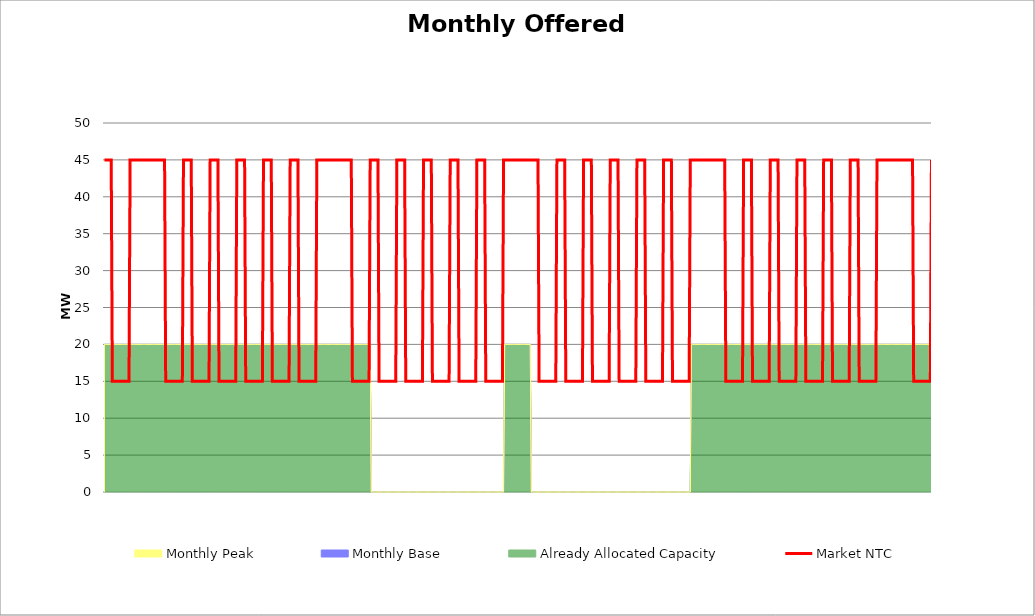
| Category | Market NTC |
|---|---|
| 0 | 45 |
| 1 | 45 |
| 2 | 45 |
| 3 | 45 |
| 4 | 45 |
| 5 | 45 |
| 6 | 45 |
| 7 | 15 |
| 8 | 15 |
| 9 | 15 |
| 10 | 15 |
| 11 | 15 |
| 12 | 15 |
| 13 | 15 |
| 14 | 15 |
| 15 | 15 |
| 16 | 15 |
| 17 | 15 |
| 18 | 15 |
| 19 | 15 |
| 20 | 15 |
| 21 | 15 |
| 22 | 15 |
| 23 | 45 |
| 24 | 45 |
| 25 | 45 |
| 26 | 45 |
| 27 | 45 |
| 28 | 45 |
| 29 | 45 |
| 30 | 45 |
| 31 | 45 |
| 32 | 45 |
| 33 | 45 |
| 34 | 45 |
| 35 | 45 |
| 36 | 45 |
| 37 | 45 |
| 38 | 45 |
| 39 | 45 |
| 40 | 45 |
| 41 | 45 |
| 42 | 45 |
| 43 | 45 |
| 44 | 45 |
| 45 | 45 |
| 46 | 45 |
| 47 | 45 |
| 48 | 45 |
| 49 | 45 |
| 50 | 45 |
| 51 | 45 |
| 52 | 45 |
| 53 | 45 |
| 54 | 45 |
| 55 | 15 |
| 56 | 15 |
| 57 | 15 |
| 58 | 15 |
| 59 | 15 |
| 60 | 15 |
| 61 | 15 |
| 62 | 15 |
| 63 | 15 |
| 64 | 15 |
| 65 | 15 |
| 66 | 15 |
| 67 | 15 |
| 68 | 15 |
| 69 | 15 |
| 70 | 15 |
| 71 | 45 |
| 72 | 45 |
| 73 | 45 |
| 74 | 45 |
| 75 | 45 |
| 76 | 45 |
| 77 | 45 |
| 78 | 45 |
| 79 | 15 |
| 80 | 15 |
| 81 | 15 |
| 82 | 15 |
| 83 | 15 |
| 84 | 15 |
| 85 | 15 |
| 86 | 15 |
| 87 | 15 |
| 88 | 15 |
| 89 | 15 |
| 90 | 15 |
| 91 | 15 |
| 92 | 15 |
| 93 | 15 |
| 94 | 15 |
| 95 | 45 |
| 96 | 45 |
| 97 | 45 |
| 98 | 45 |
| 99 | 45 |
| 100 | 45 |
| 101 | 45 |
| 102 | 45 |
| 103 | 15 |
| 104 | 15 |
| 105 | 15 |
| 106 | 15 |
| 107 | 15 |
| 108 | 15 |
| 109 | 15 |
| 110 | 15 |
| 111 | 15 |
| 112 | 15 |
| 113 | 15 |
| 114 | 15 |
| 115 | 15 |
| 116 | 15 |
| 117 | 15 |
| 118 | 15 |
| 119 | 45 |
| 120 | 45 |
| 121 | 45 |
| 122 | 45 |
| 123 | 45 |
| 124 | 45 |
| 125 | 45 |
| 126 | 45 |
| 127 | 15 |
| 128 | 15 |
| 129 | 15 |
| 130 | 15 |
| 131 | 15 |
| 132 | 15 |
| 133 | 15 |
| 134 | 15 |
| 135 | 15 |
| 136 | 15 |
| 137 | 15 |
| 138 | 15 |
| 139 | 15 |
| 140 | 15 |
| 141 | 15 |
| 142 | 15 |
| 143 | 45 |
| 144 | 45 |
| 145 | 45 |
| 146 | 45 |
| 147 | 45 |
| 148 | 45 |
| 149 | 45 |
| 150 | 45 |
| 151 | 15 |
| 152 | 15 |
| 153 | 15 |
| 154 | 15 |
| 155 | 15 |
| 156 | 15 |
| 157 | 15 |
| 158 | 15 |
| 159 | 15 |
| 160 | 15 |
| 161 | 15 |
| 162 | 15 |
| 163 | 15 |
| 164 | 15 |
| 165 | 15 |
| 166 | 15 |
| 167 | 45 |
| 168 | 45 |
| 169 | 45 |
| 170 | 45 |
| 171 | 45 |
| 172 | 45 |
| 173 | 45 |
| 174 | 45 |
| 175 | 15 |
| 176 | 15 |
| 177 | 15 |
| 178 | 15 |
| 179 | 15 |
| 180 | 15 |
| 181 | 15 |
| 182 | 15 |
| 183 | 15 |
| 184 | 15 |
| 185 | 15 |
| 186 | 15 |
| 187 | 15 |
| 188 | 15 |
| 189 | 15 |
| 190 | 15 |
| 191 | 45 |
| 192 | 45 |
| 193 | 45 |
| 194 | 45 |
| 195 | 45 |
| 196 | 45 |
| 197 | 45 |
| 198 | 45 |
| 199 | 45 |
| 200 | 45 |
| 201 | 45 |
| 202 | 45 |
| 203 | 45 |
| 204 | 45 |
| 205 | 45 |
| 206 | 45 |
| 207 | 45 |
| 208 | 45 |
| 209 | 45 |
| 210 | 45 |
| 211 | 45 |
| 212 | 45 |
| 213 | 45 |
| 214 | 45 |
| 215 | 45 |
| 216 | 45 |
| 217 | 45 |
| 218 | 45 |
| 219 | 45 |
| 220 | 45 |
| 221 | 45 |
| 222 | 45 |
| 223 | 15 |
| 224 | 15 |
| 225 | 15 |
| 226 | 15 |
| 227 | 15 |
| 228 | 15 |
| 229 | 15 |
| 230 | 15 |
| 231 | 15 |
| 232 | 15 |
| 233 | 15 |
| 234 | 15 |
| 235 | 15 |
| 236 | 15 |
| 237 | 15 |
| 238 | 15 |
| 239 | 45 |
| 240 | 45 |
| 241 | 45 |
| 242 | 45 |
| 243 | 45 |
| 244 | 45 |
| 245 | 45 |
| 246 | 45 |
| 247 | 15 |
| 248 | 15 |
| 249 | 15 |
| 250 | 15 |
| 251 | 15 |
| 252 | 15 |
| 253 | 15 |
| 254 | 15 |
| 255 | 15 |
| 256 | 15 |
| 257 | 15 |
| 258 | 15 |
| 259 | 15 |
| 260 | 15 |
| 261 | 15 |
| 262 | 15 |
| 263 | 45 |
| 264 | 45 |
| 265 | 45 |
| 266 | 45 |
| 267 | 45 |
| 268 | 45 |
| 269 | 45 |
| 270 | 45 |
| 271 | 15 |
| 272 | 15 |
| 273 | 15 |
| 274 | 15 |
| 275 | 15 |
| 276 | 15 |
| 277 | 15 |
| 278 | 15 |
| 279 | 15 |
| 280 | 15 |
| 281 | 15 |
| 282 | 15 |
| 283 | 15 |
| 284 | 15 |
| 285 | 15 |
| 286 | 15 |
| 287 | 45 |
| 288 | 45 |
| 289 | 45 |
| 290 | 45 |
| 291 | 45 |
| 292 | 45 |
| 293 | 45 |
| 294 | 45 |
| 295 | 15 |
| 296 | 15 |
| 297 | 15 |
| 298 | 15 |
| 299 | 15 |
| 300 | 15 |
| 301 | 15 |
| 302 | 15 |
| 303 | 15 |
| 304 | 15 |
| 305 | 15 |
| 306 | 15 |
| 307 | 15 |
| 308 | 15 |
| 309 | 15 |
| 310 | 15 |
| 311 | 45 |
| 312 | 45 |
| 313 | 45 |
| 314 | 45 |
| 315 | 45 |
| 316 | 45 |
| 317 | 45 |
| 318 | 45 |
| 319 | 15 |
| 320 | 15 |
| 321 | 15 |
| 322 | 15 |
| 323 | 15 |
| 324 | 15 |
| 325 | 15 |
| 326 | 15 |
| 327 | 15 |
| 328 | 15 |
| 329 | 15 |
| 330 | 15 |
| 331 | 15 |
| 332 | 15 |
| 333 | 15 |
| 334 | 15 |
| 335 | 45 |
| 336 | 45 |
| 337 | 45 |
| 338 | 45 |
| 339 | 45 |
| 340 | 45 |
| 341 | 45 |
| 342 | 45 |
| 343 | 15 |
| 344 | 15 |
| 345 | 15 |
| 346 | 15 |
| 347 | 15 |
| 348 | 15 |
| 349 | 15 |
| 350 | 15 |
| 351 | 15 |
| 352 | 15 |
| 353 | 15 |
| 354 | 15 |
| 355 | 15 |
| 356 | 15 |
| 357 | 15 |
| 358 | 15 |
| 359 | 45 |
| 360 | 45 |
| 361 | 45 |
| 362 | 45 |
| 363 | 45 |
| 364 | 45 |
| 365 | 45 |
| 366 | 45 |
| 367 | 45 |
| 368 | 45 |
| 369 | 45 |
| 370 | 45 |
| 371 | 45 |
| 372 | 45 |
| 373 | 45 |
| 374 | 45 |
| 375 | 45 |
| 376 | 45 |
| 377 | 45 |
| 378 | 45 |
| 379 | 45 |
| 380 | 45 |
| 381 | 45 |
| 382 | 45 |
| 383 | 45 |
| 384 | 45 |
| 385 | 45 |
| 386 | 45 |
| 387 | 45 |
| 388 | 45 |
| 389 | 45 |
| 390 | 45 |
| 391 | 15 |
| 392 | 15 |
| 393 | 15 |
| 394 | 15 |
| 395 | 15 |
| 396 | 15 |
| 397 | 15 |
| 398 | 15 |
| 399 | 15 |
| 400 | 15 |
| 401 | 15 |
| 402 | 15 |
| 403 | 15 |
| 404 | 15 |
| 405 | 15 |
| 406 | 15 |
| 407 | 45 |
| 408 | 45 |
| 409 | 45 |
| 410 | 45 |
| 411 | 45 |
| 412 | 45 |
| 413 | 45 |
| 414 | 45 |
| 415 | 15 |
| 416 | 15 |
| 417 | 15 |
| 418 | 15 |
| 419 | 15 |
| 420 | 15 |
| 421 | 15 |
| 422 | 15 |
| 423 | 15 |
| 424 | 15 |
| 425 | 15 |
| 426 | 15 |
| 427 | 15 |
| 428 | 15 |
| 429 | 15 |
| 430 | 15 |
| 431 | 45 |
| 432 | 45 |
| 433 | 45 |
| 434 | 45 |
| 435 | 45 |
| 436 | 45 |
| 437 | 45 |
| 438 | 45 |
| 439 | 15 |
| 440 | 15 |
| 441 | 15 |
| 442 | 15 |
| 443 | 15 |
| 444 | 15 |
| 445 | 15 |
| 446 | 15 |
| 447 | 15 |
| 448 | 15 |
| 449 | 15 |
| 450 | 15 |
| 451 | 15 |
| 452 | 15 |
| 453 | 15 |
| 454 | 15 |
| 455 | 45 |
| 456 | 45 |
| 457 | 45 |
| 458 | 45 |
| 459 | 45 |
| 460 | 45 |
| 461 | 45 |
| 462 | 45 |
| 463 | 15 |
| 464 | 15 |
| 465 | 15 |
| 466 | 15 |
| 467 | 15 |
| 468 | 15 |
| 469 | 15 |
| 470 | 15 |
| 471 | 15 |
| 472 | 15 |
| 473 | 15 |
| 474 | 15 |
| 475 | 15 |
| 476 | 15 |
| 477 | 15 |
| 478 | 15 |
| 479 | 45 |
| 480 | 45 |
| 481 | 45 |
| 482 | 45 |
| 483 | 45 |
| 484 | 45 |
| 485 | 45 |
| 486 | 45 |
| 487 | 15 |
| 488 | 15 |
| 489 | 15 |
| 490 | 15 |
| 491 | 15 |
| 492 | 15 |
| 493 | 15 |
| 494 | 15 |
| 495 | 15 |
| 496 | 15 |
| 497 | 15 |
| 498 | 15 |
| 499 | 15 |
| 500 | 15 |
| 501 | 15 |
| 502 | 15 |
| 503 | 45 |
| 504 | 45 |
| 505 | 45 |
| 506 | 45 |
| 507 | 45 |
| 508 | 45 |
| 509 | 45 |
| 510 | 45 |
| 511 | 15 |
| 512 | 15 |
| 513 | 15 |
| 514 | 15 |
| 515 | 15 |
| 516 | 15 |
| 517 | 15 |
| 518 | 15 |
| 519 | 15 |
| 520 | 15 |
| 521 | 15 |
| 522 | 15 |
| 523 | 15 |
| 524 | 15 |
| 525 | 15 |
| 526 | 15 |
| 527 | 45 |
| 528 | 45 |
| 529 | 45 |
| 530 | 45 |
| 531 | 45 |
| 532 | 45 |
| 533 | 45 |
| 534 | 45 |
| 535 | 45 |
| 536 | 45 |
| 537 | 45 |
| 538 | 45 |
| 539 | 45 |
| 540 | 45 |
| 541 | 45 |
| 542 | 45 |
| 543 | 45 |
| 544 | 45 |
| 545 | 45 |
| 546 | 45 |
| 547 | 45 |
| 548 | 45 |
| 549 | 45 |
| 550 | 45 |
| 551 | 45 |
| 552 | 45 |
| 553 | 45 |
| 554 | 45 |
| 555 | 45 |
| 556 | 45 |
| 557 | 45 |
| 558 | 45 |
| 559 | 15 |
| 560 | 15 |
| 561 | 15 |
| 562 | 15 |
| 563 | 15 |
| 564 | 15 |
| 565 | 15 |
| 566 | 15 |
| 567 | 15 |
| 568 | 15 |
| 569 | 15 |
| 570 | 15 |
| 571 | 15 |
| 572 | 15 |
| 573 | 15 |
| 574 | 15 |
| 575 | 45 |
| 576 | 45 |
| 577 | 45 |
| 578 | 45 |
| 579 | 45 |
| 580 | 45 |
| 581 | 45 |
| 582 | 45 |
| 583 | 15 |
| 584 | 15 |
| 585 | 15 |
| 586 | 15 |
| 587 | 15 |
| 588 | 15 |
| 589 | 15 |
| 590 | 15 |
| 591 | 15 |
| 592 | 15 |
| 593 | 15 |
| 594 | 15 |
| 595 | 15 |
| 596 | 15 |
| 597 | 15 |
| 598 | 15 |
| 599 | 45 |
| 600 | 45 |
| 601 | 45 |
| 602 | 45 |
| 603 | 45 |
| 604 | 45 |
| 605 | 45 |
| 606 | 45 |
| 607 | 15 |
| 608 | 15 |
| 609 | 15 |
| 610 | 15 |
| 611 | 15 |
| 612 | 15 |
| 613 | 15 |
| 614 | 15 |
| 615 | 15 |
| 616 | 15 |
| 617 | 15 |
| 618 | 15 |
| 619 | 15 |
| 620 | 15 |
| 621 | 15 |
| 622 | 15 |
| 623 | 45 |
| 624 | 45 |
| 625 | 45 |
| 626 | 45 |
| 627 | 45 |
| 628 | 45 |
| 629 | 45 |
| 630 | 45 |
| 631 | 15 |
| 632 | 15 |
| 633 | 15 |
| 634 | 15 |
| 635 | 15 |
| 636 | 15 |
| 637 | 15 |
| 638 | 15 |
| 639 | 15 |
| 640 | 15 |
| 641 | 15 |
| 642 | 15 |
| 643 | 15 |
| 644 | 15 |
| 645 | 15 |
| 646 | 15 |
| 647 | 45 |
| 648 | 45 |
| 649 | 45 |
| 650 | 45 |
| 651 | 45 |
| 652 | 45 |
| 653 | 45 |
| 654 | 45 |
| 655 | 15 |
| 656 | 15 |
| 657 | 15 |
| 658 | 15 |
| 659 | 15 |
| 660 | 15 |
| 661 | 15 |
| 662 | 15 |
| 663 | 15 |
| 664 | 15 |
| 665 | 15 |
| 666 | 15 |
| 667 | 15 |
| 668 | 15 |
| 669 | 15 |
| 670 | 15 |
| 671 | 45 |
| 672 | 45 |
| 673 | 45 |
| 674 | 45 |
| 675 | 45 |
| 676 | 45 |
| 677 | 45 |
| 678 | 45 |
| 679 | 15 |
| 680 | 15 |
| 681 | 15 |
| 682 | 15 |
| 683 | 15 |
| 684 | 15 |
| 685 | 15 |
| 686 | 15 |
| 687 | 15 |
| 688 | 15 |
| 689 | 15 |
| 690 | 15 |
| 691 | 15 |
| 692 | 15 |
| 693 | 15 |
| 694 | 15 |
| 695 | 45 |
| 696 | 45 |
| 697 | 45 |
| 698 | 45 |
| 699 | 45 |
| 700 | 45 |
| 701 | 45 |
| 702 | 45 |
| 703 | 45 |
| 704 | 45 |
| 705 | 45 |
| 706 | 45 |
| 707 | 45 |
| 708 | 45 |
| 709 | 45 |
| 710 | 45 |
| 711 | 45 |
| 712 | 45 |
| 713 | 45 |
| 714 | 45 |
| 715 | 45 |
| 716 | 45 |
| 717 | 45 |
| 718 | 45 |
| 719 | 45 |
| 720 | 45 |
| 721 | 45 |
| 722 | 45 |
| 723 | 45 |
| 724 | 45 |
| 725 | 45 |
| 726 | 45 |
| 727 | 45 |
| 728 | 15 |
| 729 | 15 |
| 730 | 15 |
| 731 | 15 |
| 732 | 15 |
| 733 | 15 |
| 734 | 15 |
| 735 | 15 |
| 736 | 15 |
| 737 | 15 |
| 738 | 15 |
| 739 | 15 |
| 740 | 15 |
| 741 | 15 |
| 742 | 15 |
| 743 | 15 |
| 744 | 45 |